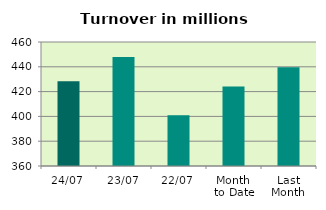
| Category | Series 0 |
|---|---|
| 24/07 | 428.253 |
| 23/07 | 447.977 |
| 22/07 | 400.834 |
| Month 
to Date | 424.169 |
| Last
Month | 439.695 |